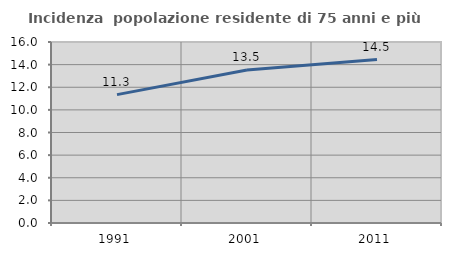
| Category | Incidenza  popolazione residente di 75 anni e più |
|---|---|
| 1991.0 | 11.349 |
| 2001.0 | 13.518 |
| 2011.0 | 14.45 |